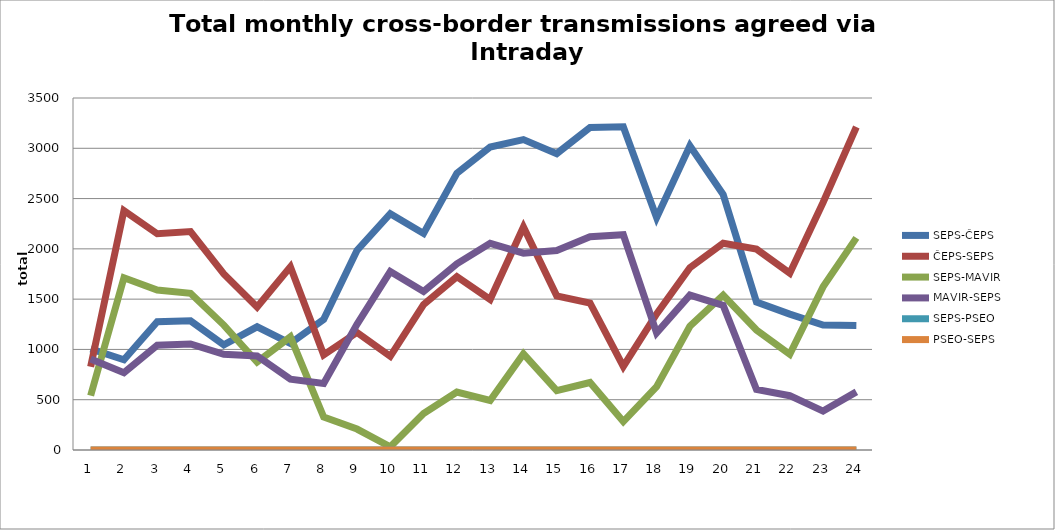
| Category | SEPS-ČEPS  | ČEPS-SEPS | SEPS-MAVIR | MAVIR-SEPS | SEPS-PSEO | PSEO-SEPS |
|---|---|---|---|---|---|---|
| 1.0 | 1006 | 827 | 541 | 904 | 0 | 0 |
| 2.0 | 897 | 2380 | 1712 | 768 | 0 | 0 |
| 3.0 | 1276 | 2150 | 1590 | 1042 | 0 | 0 |
| 4.0 | 1284 | 2172 | 1558 | 1055 | 0 | 0 |
| 5.0 | 1046 | 1750 | 1242 | 952 | 0 | 0 |
| 6.0 | 1225 | 1422 | 875 | 935 | 0 | 0 |
| 7.0 | 1060 | 1822 | 1125 | 704 | 0 | 0 |
| 8.0 | 1299 | 946 | 328 | 661 | 0 | 0 |
| 9.0 | 1985 | 1169 | 208 | 1250 | 0 | 0 |
| 10.0 | 2349 | 931 | 32 | 1774 | 0 | 0 |
| 11.0 | 2153 | 1446 | 362 | 1577 | 0 | 0 |
| 12.0 | 2752 | 1723 | 576 | 1852 | 0 | 0 |
| 13.0 | 3012 | 1497 | 493 | 2055 | 0 | 0 |
| 14.0 | 3086 | 2218 | 956 | 1957 | 0 | 0 |
| 15.0 | 2947 | 1533 | 590 | 1984 | 0 | 0 |
| 16.0 | 3206 | 1462 | 671 | 2120 | 0 | 0 |
| 17.0 | 3213 | 831 | 282 | 2140 | 0 | 0 |
| 18.0 | 2310 | 1353 | 629 | 1165 | 0 | 0 |
| 19.0 | 3025 | 1812 | 1231 | 1540 | 0 | 0 |
| 20.0 | 2539 | 2056 | 1539 | 1438 | 0 | 0 |
| 21.0 | 1470 | 1997 | 1193 | 602 | 0 | 0 |
| 22.0 | 1351 | 1758 | 952 | 540 | 0 | 0 |
| 23.0 | 1242 | 2461 | 1622 | 387 | 0 | 0 |
| 24.0 | 1237 | 3212 | 2109 | 578 | 0 | 0 |